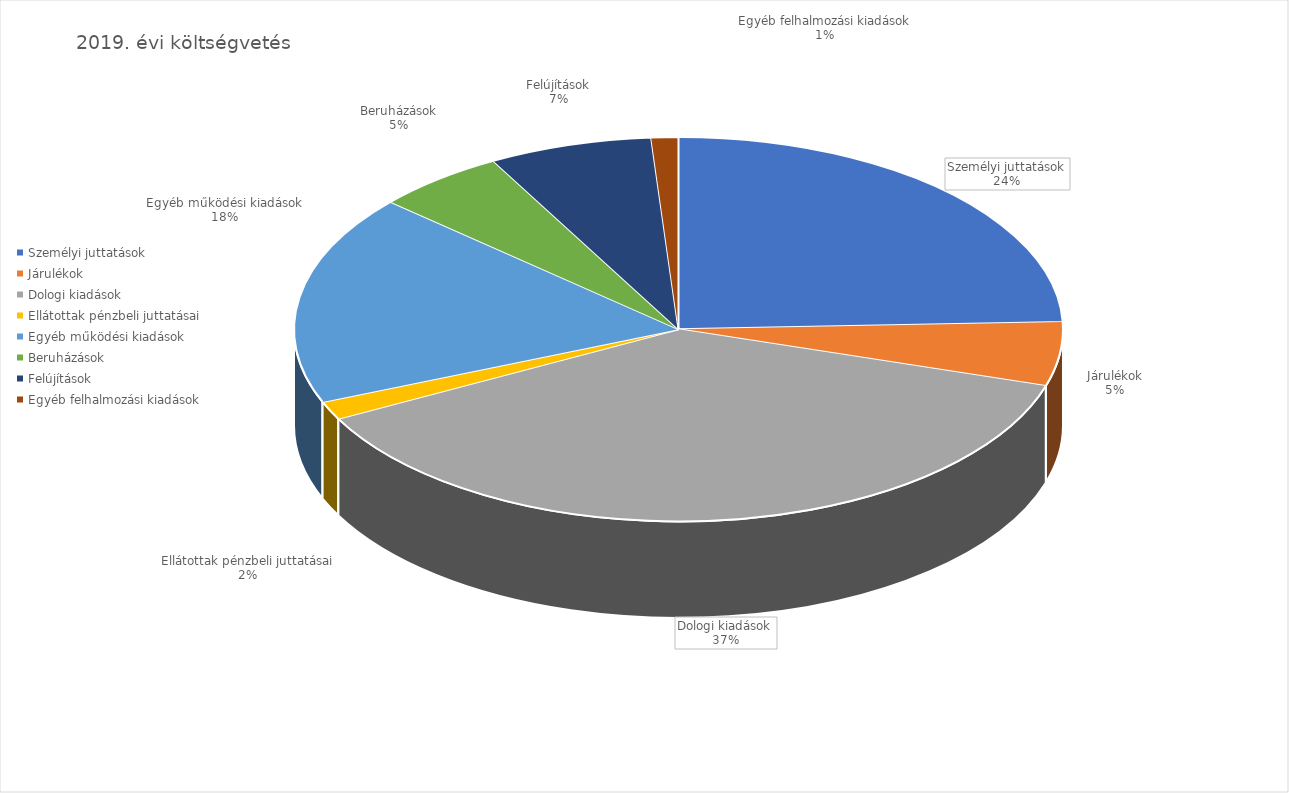
| Category | 2019 |
|---|---|
| Személyi juttatások | 7484578131 |
| Járulékok | 1649561332 |
| Dologi kiadások | 11499372534 |
| Ellátottak pénzbeli juttatásai | 474840000 |
| Egyéb működési kiadások | 5428881702 |
| Beruházások | 1679066594 |
| Felújítások | 2106398640 |
| Egyéb felhalmozási kiadások | 347532723 |